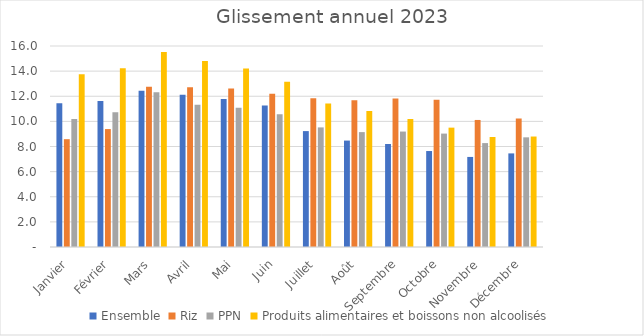
| Category |  Ensemble  |  Riz  |  PPN  |  Produits alimentaires et boissons non alcoolisés  |
|---|---|---|---|---|
| Janvier | 11.447 | 8.582 | 10.199 | 13.759 |
| Février | 11.631 | 9.387 | 10.729 | 14.221 |
| Mars | 12.433 | 12.748 | 12.316 | 15.515 |
| Avril | 12.111 | 12.71 | 11.332 | 14.814 |
| Mai | 11.786 | 12.623 | 11.094 | 14.215 |
| Juin | 11.258 | 12.19 | 10.576 | 13.156 |
| Juillet | 9.226 | 11.846 | 9.52 | 11.421 |
| Août | 8.472 | 11.678 | 9.145 | 10.825 |
| Septembre | 8.199 | 11.816 | 9.189 | 10.187 |
| Octobre | 7.639 | 11.714 | 9.027 | 9.502 |
| Novembre | 7.169 | 10.113 | 8.272 | 8.758 |
| Décembre | 7.451 | 10.22 | 8.729 | 8.794 |